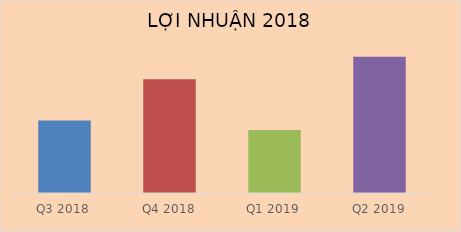
| Category | Doanh thu thuần |
|---|---|
| Q3 2018 | 3818792239187 |
| Q4 2018 | 5982167571976 |
| Q1 2019 | 3315485540340 |
| Q2 2019 | 7167419609192 |